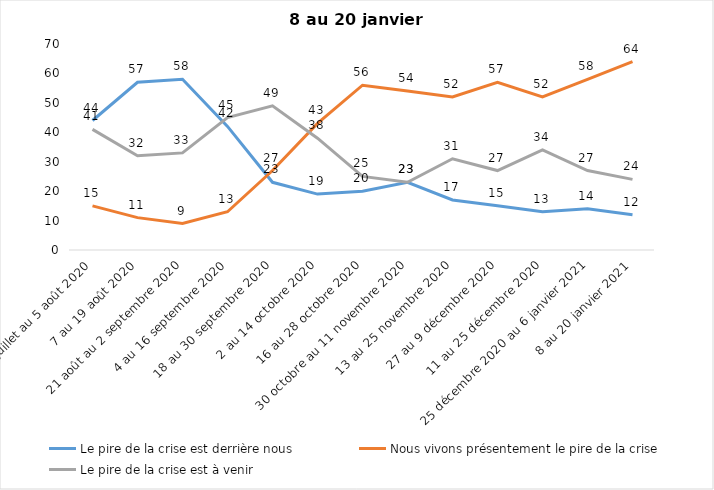
| Category | Le pire de la crise est derrière nous | Nous vivons présentement le pire de la crise | Le pire de la crise est à venir |
|---|---|---|---|
| 24 juillet au 5 août 2020 | 44 | 15 | 41 |
| 7 au 19 août 2020 | 57 | 11 | 32 |
| 21 août au 2 septembre 2020 | 58 | 9 | 33 |
| 4 au 16 septembre 2020 | 42 | 13 | 45 |
| 18 au 30 septembre 2020 | 23 | 27 | 49 |
| 2 au 14 octobre 2020 | 19 | 43 | 38 |
| 16 au 28 octobre 2020 | 20 | 56 | 25 |
| 30 octobre au 11 novembre 2020 | 23 | 54 | 23 |
| 13 au 25 novembre 2020 | 17 | 52 | 31 |
| 27 au 9 décembre 2020 | 15 | 57 | 27 |
| 11 au 25 décembre 2020 | 13 | 52 | 34 |
| 25 décembre 2020 au 6 janvier 2021 | 14 | 58 | 27 |
| 8 au 20 janvier 2021 | 12 | 64 | 24 |